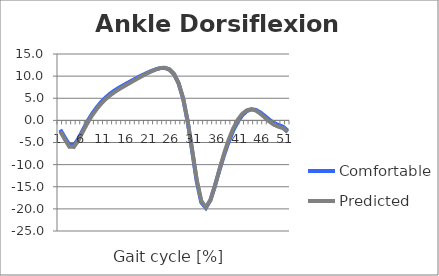
| Category | Comfortable | Predicted |
|---|---|---|
| 0 | -2.099 | -2.505 |
| 1 | -3.872 | -4.307 |
| 2 | -5.552 | -5.983 |
| 3 | -5.594 | -5.991 |
| 4 | -4.122 | -4.503 |
| 5 | -2.11 | -2.485 |
| 6 | -0.178 | -0.543 |
| 7 | 1.492 | 1.131 |
| 8 | 2.918 | 2.551 |
| 9 | 4.147 | 3.774 |
| 10 | 5.195 | 4.815 |
| 11 | 6.068 | 5.692 |
| 12 | 6.794 | 6.435 |
| 13 | 7.428 | 7.091 |
| 14 | 8.01 | 7.696 |
| 15 | 8.575 | 8.283 |
| 16 | 9.14 | 8.874 |
| 17 | 9.688 | 9.457 |
| 18 | 10.21 | 10.021 |
| 19 | 10.697 | 10.558 |
| 20 | 11.146 | 11.064 |
| 21 | 11.535 | 11.51 |
| 22 | 11.808 | 11.831 |
| 23 | 11.84 | 11.904 |
| 24 | 11.452 | 11.553 |
| 25 | 10.404 | 10.531 |
| 26 | 8.374 | 8.5 |
| 27 | 4.946 | 5.033 |
| 28 | -0.227 | -0.158 |
| 29 | -6.922 | -6.757 |
| 30 | -13.778 | -13.44 |
| 31 | -18.55 | -18.194 |
| 32 | -19.785 | -19.654 |
| 33 | -17.996 | -18.095 |
| 34 | -14.736 | -14.831 |
| 35 | -11.194 | -11.085 |
| 36 | -7.866 | -7.524 |
| 37 | -4.89 | -4.41 |
| 38 | -2.36 | -1.846 |
| 39 | -0.34 | 0.119 |
| 40 | 1.147 | 1.481 |
| 41 | 2.098 | 2.272 |
| 42 | 2.501 | 2.509 |
| 43 | 2.366 | 2.215 |
| 44 | 1.786 | 1.509 |
| 45 | 0.966 | 0.599 |
| 46 | 0.115 | -0.295 |
| 47 | -0.595 | -1.002 |
| 48 | -1.077 | -1.442 |
| 49 | -1.449 | -1.779 |
| 50 | -2.32 | -2.653 |